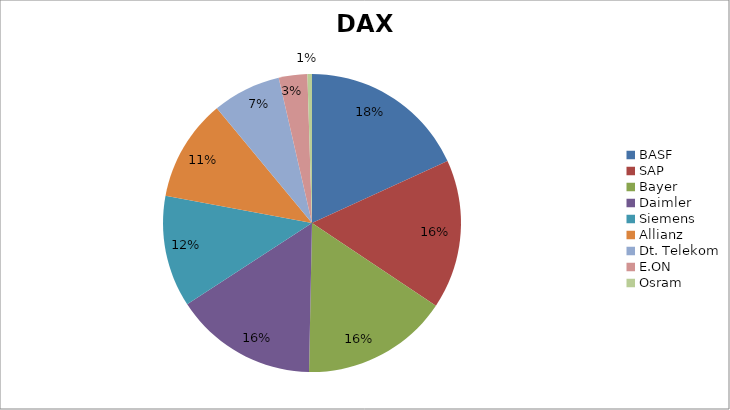
| Category | Series 0 |
|---|---|
| BASF | 36032.85 |
| SAP | 32089.65 |
| Bayer | 31604.5 |
| Daimler | 30695.2 |
| Siemens | 24028.18 |
| Allianz | 21898.8 |
| Dt. Telekom | 14729.55 |
| E.ON | 6130.66 |
| Osram | 984 |